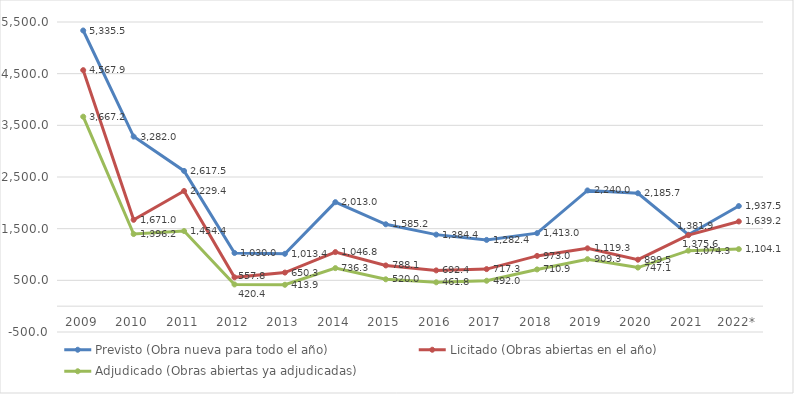
| Category | Previsto (Obra nueva para todo el año) | Licitado (Obras abiertas en el año) | Adjudicado (Obras abiertas ya adjudicadas) |
|---|---|---|---|
| 2009 | 5335.461 | 4567.868 | 3667.215 |
| 2010 | 3281.988 | 1671.018 | 1396.16 |
| 2011 | 2617.504 | 2229.381 | 1454.402 |
| 2012 | 1029.98 | 557.774 | 420.429 |
| 2013 | 1013.407 | 650.312 | 413.86 |
| 2014 | 2013.024 | 1046.781 | 736.309 |
| 2015 | 1585.224 | 788.142 | 519.982 |
| 2016 | 1384.447 | 692.431 | 461.815 |
| 2017 | 1282.383 | 717.304 | 491.977 |
| 2018 | 1413 | 973 | 710.896 |
| 2019 | 2239.952 | 1119.269 | 909.318 |
| 2020 | 2185.712 | 899.459 | 747.082 |
| 2021 | 1381.913 | 1375.6 | 1074.258 |
| 2022* | 1937.454 | 1639.249 | 1104.075 |